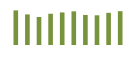
| Category | Saldo [ (1)-(2) ] |
|---|---|
| 2007.0 | 329612.931 |
| 2008.0 | 291358.085 |
| 2009.0 | 266512.131 |
| 2010.0 | 297562.723 |
| 2011.0 | 310243.352 |